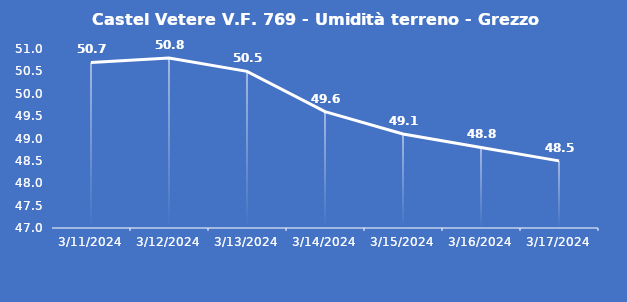
| Category | Castel Vetere V.F. 769 - Umidità terreno - Grezzo (%VWC) |
|---|---|
| 3/11/24 | 50.7 |
| 3/12/24 | 50.8 |
| 3/13/24 | 50.5 |
| 3/14/24 | 49.6 |
| 3/15/24 | 49.1 |
| 3/16/24 | 48.8 |
| 3/17/24 | 48.5 |